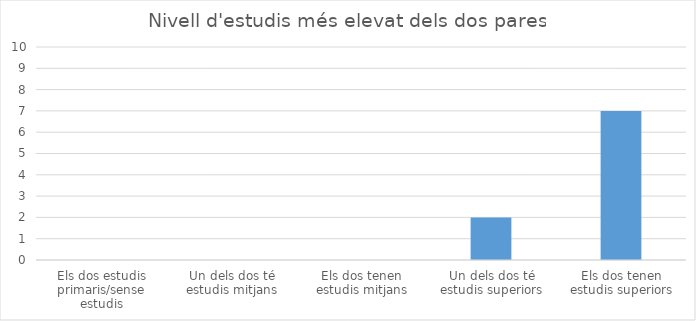
| Category | Series 0 |
|---|---|
| Els dos estudis primaris/sense estudis | 0 |
| Un dels dos té estudis mitjans | 0 |
| Els dos tenen estudis mitjans | 0 |
| Un dels dos té estudis superiors | 2 |
| Els dos tenen estudis superiors | 7 |